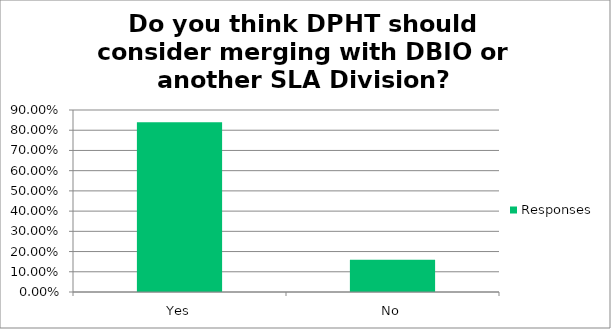
| Category | Responses |
|---|---|
| Yes | 0.84 |
| No | 0.16 |